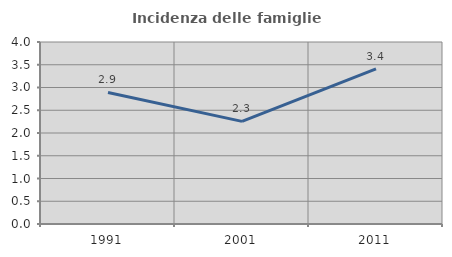
| Category | Incidenza delle famiglie numerose |
|---|---|
| 1991.0 | 2.89 |
| 2001.0 | 2.256 |
| 2011.0 | 3.409 |